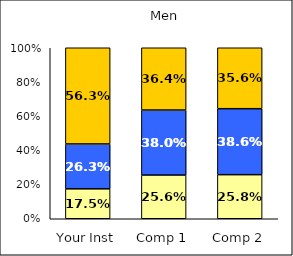
| Category | Low Negative Cross-Racial Interaction | Average Negative Cross-Racial Interaction | High Negative Cross-Racial Interaction |
|---|---|---|---|
| Your Inst | 0.175 | 0.262 | 0.562 |
| Comp 1 | 0.256 | 0.38 | 0.364 |
| Comp 2 | 0.258 | 0.386 | 0.356 |